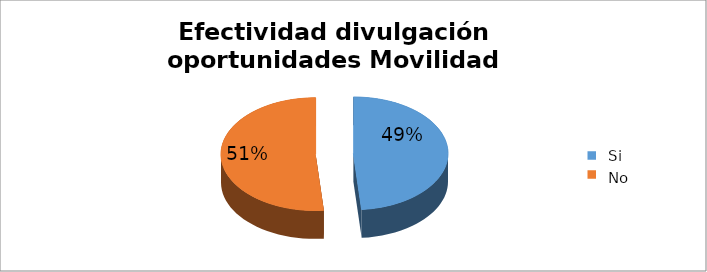
| Category | Series 0 |
|---|---|
| 0 | 0.486 |
| 1 | 0.514 |